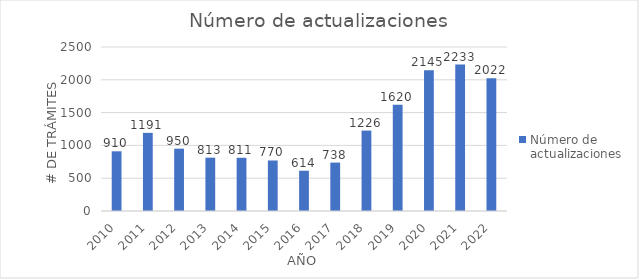
| Category | Número de actualizaciones |
|---|---|
| 2010.0 | 910 |
| 2011.0 | 1191 |
| 2012.0 | 950 |
| 2013.0 | 813 |
| 2014.0 | 811 |
| 2015.0 | 770 |
| 2016.0 | 614 |
| 2017.0 | 738 |
| 2018.0 | 1226 |
| 2019.0 | 1620 |
| 2020.0 | 2145 |
| 2021.0 | 2233 |
| 2022.0 | 2022 |